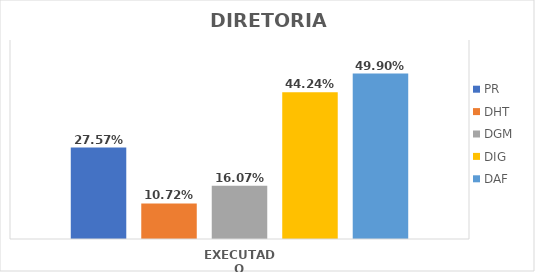
| Category | PR | DHT | DGM | DIG | DAF |
|---|---|---|---|---|---|
| EXECUTADO | 0.276 | 0.107 | 0.161 | 0.442 | 0.499 |